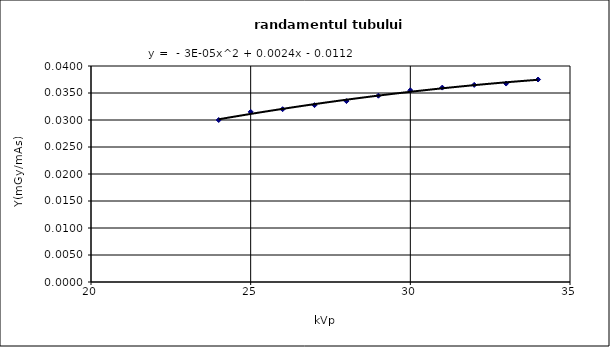
| Category | Series 0 |
|---|---|
| 24.0 | 0.03 |
| 25.0 | 0.032 |
| 26.0 | 0.032 |
| 27.0 | 0.033 |
| 28.0 | 0.034 |
| 29.0 | 0.034 |
| 30.0 | 0.036 |
| 31.0 | 0.036 |
| 32.0 | 0.036 |
| 33.0 | 0.037 |
| 34.0 | 0.038 |